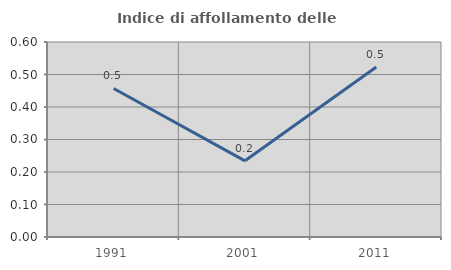
| Category | Indice di affollamento delle abitazioni  |
|---|---|
| 1991.0 | 0.457 |
| 2001.0 | 0.234 |
| 2011.0 | 0.523 |